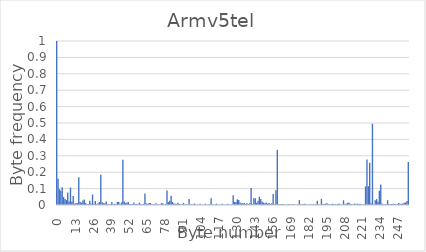
| Category | Series 0 |
|---|---|
| 0.0 | 1 |
| 1.0 | 0.16 |
| 2.0 | 0.097 |
| 3.0 | 0.087 |
| 4.0 | 0.109 |
| 5.0 | 0.049 |
| 6.0 | 0.036 |
| 7.0 | 0.03 |
| 8.0 | 0.077 |
| 9.0 | 0.021 |
| 10.0 | 0.106 |
| 11.0 | 0.02 |
| 12.0 | 0.055 |
| 13.0 | 0.008 |
| 14.0 | 0.012 |
| 15.0 | 0.011 |
| 16.0 | 0.169 |
| 17.0 | 0.02 |
| 18.0 | 0.014 |
| 19.0 | 0.027 |
| 20.0 | 0.033 |
| 21.0 | 0.013 |
| 22.0 | 0.006 |
| 23.0 | 0.006 |
| 24.0 | 0.026 |
| 25.0 | 0.007 |
| 26.0 | 0.064 |
| 27.0 | 0.008 |
| 28.0 | 0.025 |
| 29.0 | 0.004 |
| 30.0 | 0.011 |
| 31.0 | 0.018 |
| 32.0 | 0.184 |
| 33.0 | 0.016 |
| 34.0 | 0.011 |
| 35.0 | 0.01 |
| 36.0 | 0.021 |
| 37.0 | 0.005 |
| 38.0 | 0.005 |
| 39.0 | 0.005 |
| 40.0 | 0.018 |
| 41.0 | 0.004 |
| 42.0 | 0.008 |
| 43.0 | 0.004 |
| 44.0 | 0.019 |
| 45.0 | 0.018 |
| 46.0 | 0.005 |
| 47.0 | 0.016 |
| 48.0 | 0.276 |
| 49.0 | 0.021 |
| 50.0 | 0.012 |
| 51.0 | 0.015 |
| 52.0 | 0.018 |
| 53.0 | 0.007 |
| 54.0 | 0.005 |
| 55.0 | 0.005 |
| 56.0 | 0.015 |
| 57.0 | 0.004 |
| 58.0 | 0.007 |
| 59.0 | 0.004 |
| 60.0 | 0.014 |
| 61.0 | 0.004 |
| 62.0 | 0.005 |
| 63.0 | 0.007 |
| 64.0 | 0.07 |
| 65.0 | 0.009 |
| 66.0 | 0.008 |
| 67.0 | 0.012 |
| 68.0 | 0.012 |
| 69.0 | 0.004 |
| 70.0 | 0.004 |
| 71.0 | 0.005 |
| 72.0 | 0.011 |
| 73.0 | 0.004 |
| 74.0 | 0.003 |
| 75.0 | 0.004 |
| 76.0 | 0.011 |
| 77.0 | 0.009 |
| 78.0 | 0.003 |
| 79.0 | 0.006 |
| 80.0 | 0.089 |
| 81.0 | 0.018 |
| 82.0 | 0.026 |
| 83.0 | 0.057 |
| 84.0 | 0.018 |
| 85.0 | 0.01 |
| 86.0 | 0.008 |
| 87.0 | 0.007 |
| 88.0 | 0.013 |
| 89.0 | 0.005 |
| 90.0 | 0.005 |
| 91.0 | 0.004 |
| 92.0 | 0.013 |
| 93.0 | 0.002 |
| 94.0 | 0.005 |
| 95.0 | 0.003 |
| 96.0 | 0.037 |
| 97.0 | 0.005 |
| 98.0 | 0.004 |
| 99.0 | 0.004 |
| 100.0 | 0.009 |
| 101.0 | 0.003 |
| 102.0 | 0.003 |
| 103.0 | 0.002 |
| 104.0 | 0.008 |
| 105.0 | 0.002 |
| 106.0 | 0.002 |
| 107.0 | 0.003 |
| 108.0 | 0.008 |
| 109.0 | 0.002 |
| 110.0 | 0.003 |
| 111.0 | 0.005 |
| 112.0 | 0.041 |
| 113.0 | 0.004 |
| 114.0 | 0.003 |
| 115.0 | 0.003 |
| 116.0 | 0.008 |
| 117.0 | 0.002 |
| 118.0 | 0.002 |
| 119.0 | 0.002 |
| 120.0 | 0.007 |
| 121.0 | 0.002 |
| 122.0 | 0.002 |
| 123.0 | 0.002 |
| 124.0 | 0.007 |
| 125.0 | 0.002 |
| 126.0 | 0.003 |
| 127.0 | 0.003 |
| 128.0 | 0.06 |
| 129.0 | 0.019 |
| 130.0 | 0.019 |
| 131.0 | 0.035 |
| 132.0 | 0.031 |
| 133.0 | 0.015 |
| 134.0 | 0.01 |
| 135.0 | 0.01 |
| 136.0 | 0.012 |
| 137.0 | 0.006 |
| 138.0 | 0.011 |
| 139.0 | 0.005 |
| 140.0 | 0.011 |
| 141.0 | 0.104 |
| 142.0 | 0.005 |
| 143.0 | 0.041 |
| 144.0 | 0.042 |
| 145.0 | 0.013 |
| 146.0 | 0.025 |
| 147.0 | 0.05 |
| 148.0 | 0.037 |
| 149.0 | 0.02 |
| 150.0 | 0.014 |
| 151.0 | 0.011 |
| 152.0 | 0.015 |
| 153.0 | 0.008 |
| 154.0 | 0.012 |
| 155.0 | 0.006 |
| 156.0 | 0.01 |
| 157.0 | 0.067 |
| 158.0 | 0.004 |
| 159.0 | 0.09 |
| 160.0 | 0.336 |
| 161.0 | 0.005 |
| 162.0 | 0.005 |
| 163.0 | 0.005 |
| 164.0 | 0.007 |
| 165.0 | 0.003 |
| 166.0 | 0.002 |
| 167.0 | 0.002 |
| 168.0 | 0.006 |
| 169.0 | 0.002 |
| 170.0 | 0.004 |
| 171.0 | 0.002 |
| 172.0 | 0.007 |
| 173.0 | 0.002 |
| 174.0 | 0.003 |
| 175.0 | 0.002 |
| 176.0 | 0.03 |
| 177.0 | 0.005 |
| 178.0 | 0.005 |
| 179.0 | 0.005 |
| 180.0 | 0.007 |
| 181.0 | 0.003 |
| 182.0 | 0.003 |
| 183.0 | 0.002 |
| 184.0 | 0.006 |
| 185.0 | 0.002 |
| 186.0 | 0.006 |
| 187.0 | 0.002 |
| 188.0 | 0.007 |
| 189.0 | 0.026 |
| 190.0 | 0.004 |
| 191.0 | 0.003 |
| 192.0 | 0.037 |
| 193.0 | 0.006 |
| 194.0 | 0.006 |
| 195.0 | 0.009 |
| 196.0 | 0.01 |
| 197.0 | 0.004 |
| 198.0 | 0.004 |
| 199.0 | 0.004 |
| 200.0 | 0.008 |
| 201.0 | 0.004 |
| 202.0 | 0.006 |
| 203.0 | 0.004 |
| 204.0 | 0.008 |
| 205.0 | 0.007 |
| 206.0 | 0.003 |
| 207.0 | 0.003 |
| 208.0 | 0.029 |
| 209.0 | 0.007 |
| 210.0 | 0.008 |
| 211.0 | 0.013 |
| 212.0 | 0.013 |
| 213.0 | 0.007 |
| 214.0 | 0.005 |
| 215.0 | 0.005 |
| 216.0 | 0.009 |
| 217.0 | 0.005 |
| 218.0 | 0.008 |
| 219.0 | 0.006 |
| 220.0 | 0.008 |
| 221.0 | 0.005 |
| 222.0 | 0.004 |
| 223.0 | 0.004 |
| 224.0 | 0.113 |
| 225.0 | 0.278 |
| 226.0 | 0.115 |
| 227.0 | 0.257 |
| 228.0 | 0.011 |
| 229.0 | 0.495 |
| 230.0 | 0.004 |
| 231.0 | 0.029 |
| 232.0 | 0.036 |
| 233.0 | 0.019 |
| 234.0 | 0.087 |
| 235.0 | 0.126 |
| 236.0 | 0.007 |
| 237.0 | 0.004 |
| 238.0 | 0.004 |
| 239.0 | 0.004 |
| 240.0 | 0.029 |
| 241.0 | 0.006 |
| 242.0 | 0.005 |
| 243.0 | 0.005 |
| 244.0 | 0.008 |
| 245.0 | 0.005 |
| 246.0 | 0.005 |
| 247.0 | 0.006 |
| 248.0 | 0.012 |
| 249.0 | 0.008 |
| 250.0 | 0.008 |
| 251.0 | 0.009 |
| 252.0 | 0.014 |
| 253.0 | 0.014 |
| 254.0 | 0.025 |
| 255.0 | 0.261 |